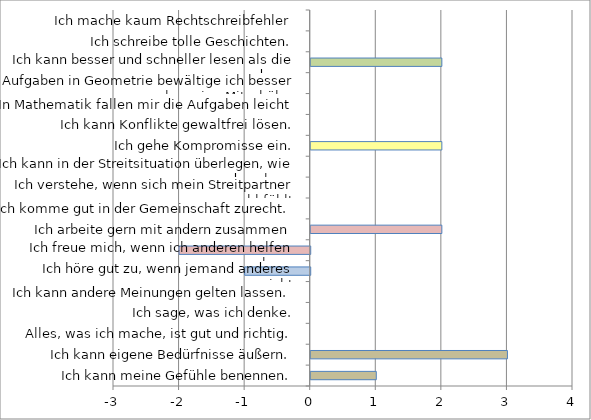
| Category | Series 0 |
|---|---|
| Ich kann meine Gefühle benennen. | 1 |
| Ich kann eigene Bedürfnisse äußern. | 3 |
| Alles, was ich mache, ist gut und richtig. | 0 |
| Ich sage, was ich denke. | 0 |
| Ich kann andere Meinungen gelten lassen. | 0 |
| Ich höre gut zu, wenn jemand anderes spricht. | -1 |
| Ich freue mich, wenn ich anderen helfen kann. | -2 |
| Ich arbeite gern mit andern zusammen | 2 |
| Ich komme gut in der Gemeinschaft zurecht. | 0 |
| Ich verstehe, wenn sich mein Streitpartner unwohl fühlt. | 0 |
| Ich kann in der Streitsituation überlegen, wie es dazu kam. | 0 |
| Ich gehe Kompromisse ein. | 2 |
| Ich kann Konflikte gewaltfrei lösen. | 0 |
| In Mathematik fallen mir die Aufgaben leicht | 0 |
| Aufgaben in Geometrie bewältige ich besser als meine Mitschüler. | 0 |
| Ich kann besser und schneller lesen als die anderen. | 2 |
| Ich schreibe tolle Geschichten. | 0 |
| Ich mache kaum Rechtschreibfehler | 0 |